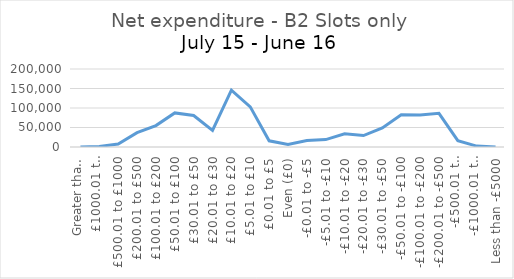
| Category | B2 Slots only |
|---|---|
| Greater than £5000 | 0 |
| £1000.01 to £5000 | 1522 |
| £500.01 to £1000 | 7695 |
| £200.01 to £500 | 36811 |
| £100.01 to £200 | 54995 |
| £50.01 to £100 | 87450 |
| £30.01 to £50 | 80756 |
| £20.01 to £30 | 42745 |
| £10.01 to £20 | 145913 |
| £5.01 to £10 | 102896 |
| £0.01 to £5 | 15811 |
| Even (£0) | 6201 |
| -£0.01 to -£5 | 16455 |
| -£5.01 to -£10 | 18932 |
| -£10.01 to -£20 | 33692 |
| -£20.01 to -£30 | 29256 |
| -£30.01 to -£50 | 48730 |
| -£50.01 to -£100 | 82496 |
| -£100.01 to -£200 | 82276 |
| -£200.01 to -£500 | 86245 |
| -£500.01 to -£1000 | 16323 |
| -£1000.01 to -£5000 | 2320 |
| Less than -£5000 | 1 |